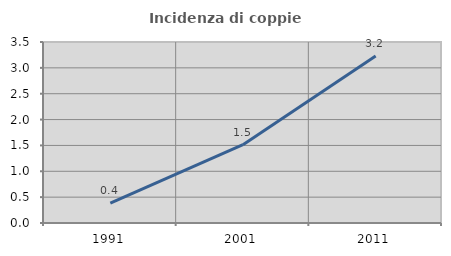
| Category | Incidenza di coppie miste |
|---|---|
| 1991.0 | 0.382 |
| 2001.0 | 1.514 |
| 2011.0 | 3.23 |